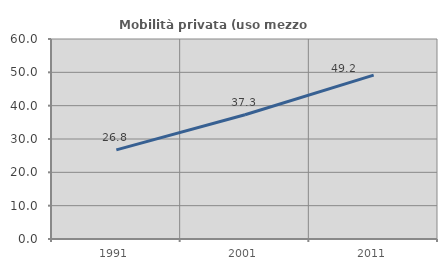
| Category | Mobilità privata (uso mezzo privato) |
|---|---|
| 1991.0 | 26.75 |
| 2001.0 | 37.26 |
| 2011.0 | 49.162 |